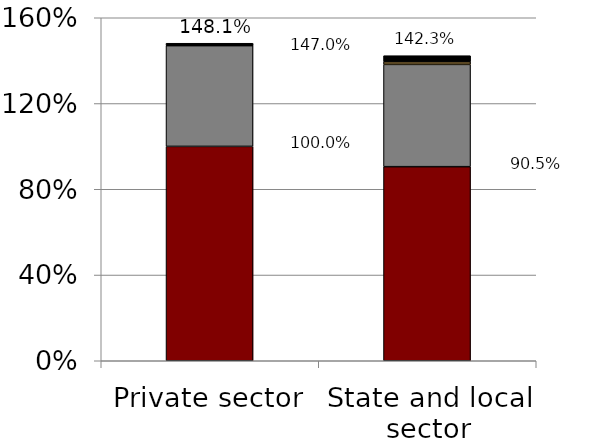
| Category | Wages | ECEC Benefits | Discount Rate/ECEC NC Adjustment | Retiree Health |
|---|---|---|---|---|
| Private sector | 1 | 0.47 | 0 | 0.011 |
| State and local sector | 0.905 | 0.477 | 0.013 | 0.028 |